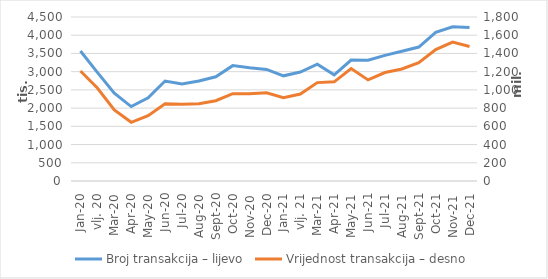
| Category | Broj transakcija – lijevo |
|---|---|
| sij.20 | 3566905 |
| vlj. 20 | 2979757 |
| ožu.20 | 2408904 |
| tra.20 | 2042680 |
| svi.20 | 2283539 |
| lip.20 | 2743315 |
| srp.20 | 2659954 |
| kol.20 | 2741896 |
| ruj.20 | 2859464 |
| lis.20 | 3165602 |
| stu.20 | 3107930 |
| pro.20 | 3062223 |
| sij.21 | 2885841 |
| vlj. 21 | 2990269 |
| ožu.21 | 3203975 |
| tra.21 | 2912983 |
| svi.21 | 3318432 |
| lip.21 | 3312133 |
| srp.21 | 3448355 |
| kol.21 | 3557999 |
| ruj.21 | 3676273 |
| lis.21 | 4077123 |
| stu.21 | 4230737 |
| pro.21 | 4210962 |